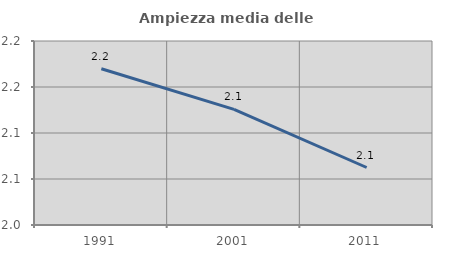
| Category | Ampiezza media delle famiglie |
|---|---|
| 1991.0 | 2.17 |
| 2001.0 | 2.126 |
| 2011.0 | 2.062 |